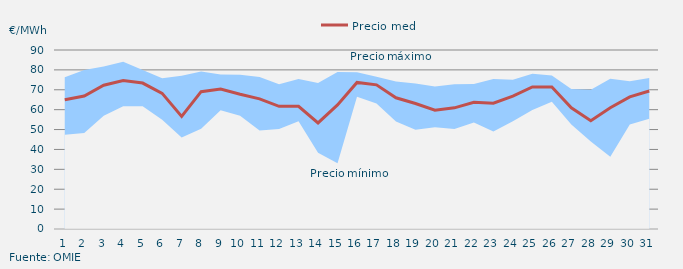
| Category | Precio medio |
|---|---|
| 1 | 64.949 |
| 2 | 66.884 |
| 3 | 72.304 |
| 4 | 74.684 |
| 5 | 73.377 |
| 6 | 68.188 |
| 7 | 56.612 |
| 8 | 69.054 |
| 9 | 70.37 |
| 10 | 67.765 |
| 11 | 65.424 |
| 12 | 61.688 |
| 13 | 61.656 |
| 14 | 53.326 |
| 15 | 62.375 |
| 16 | 73.697 |
| 17 | 72.469 |
| 18 | 65.961 |
| 19 | 63.1 |
| 20 | 59.694 |
| 21 | 60.907 |
| 22 | 63.729 |
| 23 | 63.228 |
| 24 | 66.847 |
| 25 | 71.426 |
| 26 | 71.385 |
| 27 | 60.968 |
| 28 | 54.397 |
| 29 | 60.942 |
| 30 | 66.406 |
| 31 | 69.409 |